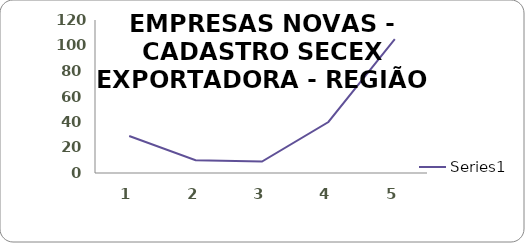
| Category | Series 0 |
|---|---|
| 0 | 29 |
| 1 | 10 |
| 2 | 9 |
| 3 | 40 |
| 4 | 105 |